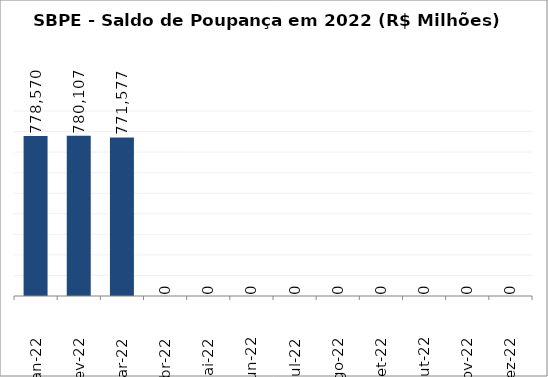
| Category | SBPE - Saldo de Poupança em 2022 (R$ Milhões) |
|---|---|
| Jan-22 | 778569.77 |
| Fev-22 | 780106.681 |
| Mar-22 | 771576.872 |
| Abr-22 | 0 |
| Mai-22 | 0 |
| Jun-22 | 0 |
| Jul-22 | 0 |
| Ago-22 | 0 |
| Set-22 | 0 |
| Out-22 | 0 |
| Nov-22 | 0 |
| Dez-22 | 0 |